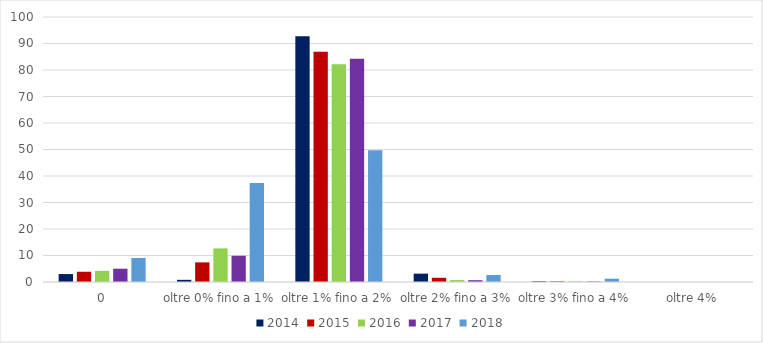
| Category | 2014 | 2015 | 2016 | 2017 | 2018 |
|---|---|---|---|---|---|
| 0 | 3.002 | 3.864 | 4.195 | 5.018 | 9.069 |
| oltre 0% fino a 1% | 0.818 | 7.403 | 12.683 | 9.902 | 37.315 |
| oltre 1% fino a 2% | 92.754 | 86.913 | 82.17 | 84.209 | 49.725 |
| oltre 2% fino a 3% | 3.153 | 1.585 | 0.727 | 0.677 | 2.65 |
| oltre 3% fino a 4% | 0.272 | 0.235 | 0.225 | 0.195 | 1.241 |
| oltre 4% | 0.002 | 0 | 0 | 0 | 0 |